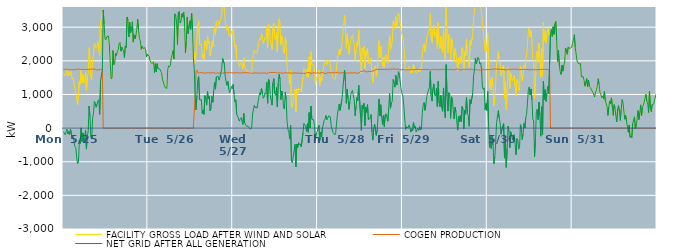
| Category | FACILITY GROSS LOAD AFTER WIND AND SOLAR | COGEN PRODUCTION | NET GRID AFTER ALL GENERATION |
|---|---|---|---|
|  Mon  5/25 | 1643 | 1751 | -108 |
|  Mon  5/25 | 1659 | 1756 | -97 |
|  Mon  5/25 | 1548 | 1749 | -201 |
|  Mon  5/25 | 1628 | 1735 | -107 |
|  Mon  5/25 | 1712 | 1747 | -35 |
|  Mon  5/25 | 1551 | 1727 | -176 |
|  Mon  5/25 | 1649 | 1742 | -93 |
|  Mon  5/25 | 1566 | 1762 | -196 |
|  Mon  5/25 | 1702 | 1733 | -31 |
|  Mon  5/25 | 1574 | 1745 | -171 |
|  Mon  5/25 | 1453 | 1741 | -288 |
|  Mon  5/25 | 1504 | 1746 | -242 |
|  Mon  5/25 | 1310 | 1738 | -428 |
|  Mon  5/25 | 1175 | 1729 | -554 |
|  Mon  5/25 | 1159 | 1743 | -584 |
|  Mon  5/25 | 866 | 1743 | -877 |
|  Mon  5/25 | 698 | 1757 | -1059 |
|  Mon  5/25 | 725 | 1738 | -1013 |
|  Mon  5/25 | 1395 | 1751 | -356 |
|  Mon  5/25 | 1305 | 1763 | -458 |
|  Mon  5/25 | 1745 | 1739 | 6 |
|  Mon  5/25 | 1346 | 1748 | -402 |
|  Mon  5/25 | 1605 | 1747 | -142 |
|  Mon  5/25 | 1348 | 1735 | -387 |
|  Mon  5/25 | 1460 | 1737 | -277 |
|  Mon  5/25 | 1678 | 1737 | -59 |
|  Mon  5/25 | 1126 | 1751 | -625 |
|  Mon  5/25 | 1510 | 1738 | -228 |
|  Mon  5/25 | 1637 | 1738 | -101 |
|  Mon  5/25 | 2393 | 1739 | 654 |
|  Mon  5/25 | 2094 | 1751 | 343 |
|  Mon  5/25 | 1470 | 1745 | -275 |
|  Mon  5/25 | 1432 | 1754 | -322 |
|  Mon  5/25 | 2045 | 1746 | 299 |
|  Mon  5/25 | 2188 | 1751 | 437 |
|  Mon  5/25 | 2523 | 1735 | 788 |
|  Mon  5/25 | 2480 | 1748 | 732 |
|  Mon  5/25 | 2367 | 1748 | 619 |
|  Mon  5/25 | 2435 | 1725 | 710 |
|  Mon  5/25 | 2552 | 1744 | 808 |
|  Mon  5/25 | 2578 | 1733 | 845 |
|  Mon  5/25 | 2157 | 1750 | 407 |
|  Mon  5/25 | 3149 | 1749 | 1400 |
|  Mon  5/25 | 3158 | 1755 | 1403 |
|  Mon  5/25 | 3460 | 1745 | 1715 |
|  Mon  5/25 | 3509 | 0 | 3509 |
|  Mon  5/25 | 3085 | 0 | 3085 |
|  Mon  5/25 | 2661 | 0 | 2661 |
|  Mon  5/25 | 2623 | 0 | 2623 |
|  Mon  5/25 | 2709 | 0 | 2709 |
|  Mon  5/25 | 2681 | 0 | 2681 |
|  Mon  5/25 | 2739 | 0 | 2739 |
|  Mon  5/25 | 2442 | 0 | 2442 |
|  Mon  5/25 | 1900 | 0 | 1900 |
|  Mon  5/25 | 1462 | 0 | 1462 |
|  Mon  5/25 | 1497 | 0 | 1497 |
|  Mon  5/25 | 2306 | 0 | 2306 |
|  Mon  5/25 | 1883 | 0 | 1883 |
|  Mon  5/25 | 1922 | 0 | 1922 |
|  Mon  5/25 | 2224 | 0 | 2224 |
|  Mon  5/25 | 2158 | 0 | 2158 |
|  Mon  5/25 | 2287 | 0 | 2287 |
|  Mon  5/25 | 2330 | 0 | 2330 |
|  Mon  5/25 | 2515 | 0 | 2515 |
|  Mon  5/25 | 2547 | 0 | 2547 |
|  Mon  5/25 | 2285 | 0 | 2285 |
|  Mon  5/25 | 2409 | 0 | 2409 |
|  Mon  5/25 | 2404 | 0 | 2404 |
|  Mon  5/25 | 2295 | 0 | 2295 |
|  Mon  5/25 | 2094 | 0 | 2094 |
|  Mon  5/25 | 2442 | 0 | 2442 |
|  Mon  5/25 | 2391 | 0 | 2391 |
|  Mon  5/25 | 3303 | 0 | 3303 |
|  Mon  5/25 | 3210 | 0 | 3210 |
|  Mon  5/25 | 2708 | 0 | 2708 |
|  Mon  5/25 | 3145 | 0 | 3145 |
|  Mon  5/25 | 2839 | 0 | 2839 |
|  Mon  5/25 | 2936 | 0 | 2936 |
|  Mon  5/25 | 3161 | 0 | 3161 |
|  Mon  5/25 | 2555 | 0 | 2555 |
|  Mon  5/25 | 2771 | 0 | 2771 |
|  Mon  5/25 | 2655 | 0 | 2655 |
|  Mon  5/25 | 2762 | 0 | 2762 |
|  Mon  5/25 | 2939 | 0 | 2939 |
|  Mon  5/25 | 3234 | 0 | 3234 |
|  Mon  5/25 | 2901 | 0 | 2901 |
|  Mon  5/25 | 2656 | 0 | 2656 |
|  Mon  5/25 | 2603 | 0 | 2603 |
|  Mon  5/25 | 2339 | 0 | 2339 |
|  Mon  5/25 | 2437 | 0 | 2437 |
|  Mon  5/25 | 2364 | 0 | 2364 |
|  Mon  5/25 | 2357 | 0 | 2357 |
|  Mon  5/25 | 2392 | 0 | 2392 |
|  Mon  5/25 | 2320 | 0 | 2320 |
|  Mon  5/25 | 2122 | 0 | 2122 |
|  Mon  5/25 | 2197 | 0 | 2197 |
|  Tue  5/26 | 2205 | 0 | 2205 |
|  Tue  5/26 | 2134 | 0 | 2134 |
|  Tue  5/26 | 2007 | 0 | 2007 |
|  Tue  5/26 | 1957 | 0 | 1957 |
|  Tue  5/26 | 1917 | 0 | 1917 |
|  Tue  5/26 | 1929 | 0 | 1929 |
|  Tue  5/26 | 1968 | 0 | 1968 |
|  Tue  5/26 | 1647 | 0 | 1647 |
|  Tue  5/26 | 1913 | 0 | 1913 |
|  Tue  5/26 | 1668 | 0 | 1668 |
|  Tue  5/26 | 1917 | 0 | 1917 |
|  Tue  5/26 | 1763 | 0 | 1763 |
|  Tue  5/26 | 1788 | 0 | 1788 |
|  Tue  5/26 | 1758 | 0 | 1758 |
|  Tue  5/26 | 1742 | 0 | 1742 |
|  Tue  5/26 | 1647 | 0 | 1647 |
|  Tue  5/26 | 1457 | 0 | 1457 |
|  Tue  5/26 | 1370 | 0 | 1370 |
|  Tue  5/26 | 1273 | 0 | 1273 |
|  Tue  5/26 | 1206 | 0 | 1206 |
|  Tue  5/26 | 1228 | 0 | 1228 |
|  Tue  5/26 | 1181 | 0 | 1181 |
|  Tue  5/26 | 1741 | 0 | 1741 |
|  Tue  5/26 | 1853 | 0 | 1853 |
|  Tue  5/26 | 1818 | 0 | 1818 |
|  Tue  5/26 | 1869 | 0 | 1869 |
|  Tue  5/26 | 2098 | 0 | 2098 |
|  Tue  5/26 | 2181 | 0 | 2181 |
|  Tue  5/26 | 2304 | 0 | 2304 |
|  Tue  5/26 | 2061 | 0 | 2061 |
|  Tue  5/26 | 3398 | 0 | 3398 |
|  Tue  5/26 | 3365 | 0 | 3365 |
|  Tue  5/26 | 3157 | 0 | 3157 |
|  Tue  5/26 | 2486 | 0 | 2486 |
|  Tue  5/26 | 3437 | 0 | 3437 |
|  Tue  5/26 | 3474 | 0 | 3474 |
|  Tue  5/26 | 3125 | 0 | 3125 |
|  Tue  5/26 | 3188 | 0 | 3188 |
|  Tue  5/26 | 3402 | 0 | 3402 |
|  Tue  5/26 | 3299 | 0 | 3299 |
|  Tue  5/26 | 3446 | 0 | 3446 |
|  Tue  5/26 | 3129 | 0 | 3129 |
|  Tue  5/26 | 2240 | 0 | 2240 |
|  Tue  5/26 | 2575 | 0 | 2575 |
|  Tue  5/26 | 3301 | 0 | 3301 |
|  Tue  5/26 | 2806 | 0 | 2806 |
|  Tue  5/26 | 2784 | 0 | 2784 |
|  Tue  5/26 | 3188 | 0 | 3188 |
|  Tue  5/26 | 2934 | 0 | 2934 |
|  Tue  5/26 | 3419 | 0 | 3419 |
|  Tue  5/26 | 2978 | 0 | 2978 |
|  Tue  5/26 | 2084 | 0 | 2084 |
|  Tue  5/26 | 2242 | 494 | 1748 |
|  Tue  5/26 | 1927 | 988 | 939 |
|  Tue  5/26 | 2229 | 1690 | 539 |
|  Tue  5/26 | 2681 | 1729 | 952 |
|  Tue  5/26 | 3090 | 1641 | 1449 |
|  Tue  5/26 | 3174 | 1645 | 1529 |
|  Tue  5/26 | 2476 | 1636 | 840 |
|  Tue  5/26 | 2475 | 1653 | 822 |
|  Tue  5/26 | 2495 | 1652 | 843 |
|  Tue  5/26 | 2079 | 1646 | 433 |
|  Tue  5/26 | 2184 | 1644 | 540 |
|  Tue  5/26 | 2045 | 1636 | 409 |
|  Tue  5/26 | 2595 | 1629 | 966 |
|  Tue  5/26 | 2518 | 1641 | 877 |
|  Tue  5/26 | 2324 | 1643 | 681 |
|  Tue  5/26 | 2727 | 1637 | 1090 |
|  Tue  5/26 | 2517 | 1645 | 872 |
|  Tue  5/26 | 2581 | 1638 | 943 |
|  Tue  5/26 | 2149 | 1641 | 508 |
|  Tue  5/26 | 2272 | 1656 | 616 |
|  Tue  5/26 | 2585 | 1641 | 944 |
|  Tue  5/26 | 2407 | 1638 | 769 |
|  Tue  5/26 | 2755 | 1647 | 1108 |
|  Tue  5/26 | 2996 | 1638 | 1358 |
|  Tue  5/26 | 2783 | 1628 | 1155 |
|  Tue  5/26 | 3165 | 1643 | 1522 |
|  Tue  5/26 | 3164 | 1641 | 1523 |
|  Tue  5/26 | 3192 | 1650 | 1542 |
|  Tue  5/26 | 3053 | 1631 | 1422 |
|  Tue  5/26 | 3136 | 1634 | 1502 |
|  Tue  5/26 | 3253 | 1636 | 1617 |
|  Tue  5/26 | 3383 | 1634 | 1749 |
|  Tue  5/26 | 3710 | 1637 | 2073 |
|  Tue  5/26 | 3709 | 1651 | 2058 |
|  Tue  5/26 | 3550 | 1636 | 1914 |
|  Tue  5/26 | 3175 | 1642 | 1533 |
|  Tue  5/26 | 3041 | 1652 | 1389 |
|  Tue  5/26 | 2911 | 1637 | 1274 |
|  Tue  5/26 | 3023 | 1640 | 1383 |
|  Tue  5/26 | 2811 | 1642 | 1169 |
|  Tue  5/26 | 2710 | 1655 | 1055 |
|  Tue  5/26 | 2749 | 1635 | 1114 |
|  Tue  5/26 | 2884 | 1644 | 1240 |
|  Tue  5/26 | 2816 | 1648 | 1168 |
|  Wed  5/27 | 2939 | 1642 | 1297 |
|  Wed  5/27 | 2653 | 1640 | 1013 |
|  Wed  5/27 | 2418 | 1639 | 779 |
|  Wed  5/27 | 2476 | 1634 | 842 |
|  Wed  5/27 | 2068 | 1656 | 412 |
|  Wed  5/27 | 2062 | 1662 | 400 |
|  Wed  5/27 | 1936 | 1640 | 296 |
|  Wed  5/27 | 1834 | 1627 | 207 |
|  Wed  5/27 | 1917 | 1636 | 281 |
|  Wed  5/27 | 1956 | 1644 | 312 |
|  Wed  5/27 | 1932 | 1643 | 289 |
|  Wed  5/27 | 1751 | 1645 | 106 |
|  Wed  5/27 | 2083 | 1647 | 436 |
|  Wed  5/27 | 1812 | 1653 | 159 |
|  Wed  5/27 | 1779 | 1649 | 130 |
|  Wed  5/27 | 1702 | 1644 | 58 |
|  Wed  5/27 | 1691 | 1646 | 45 |
|  Wed  5/27 | 1696 | 1642 | 54 |
|  Wed  5/27 | 1650 | 1638 | 12 |
|  Wed  5/27 | 1651 | 1637 | 14 |
|  Wed  5/27 | 1602 | 1631 | -29 |
|  Wed  5/27 | 1669 | 1643 | 26 |
|  Wed  5/27 | 2047 | 1629 | 418 |
|  Wed  5/27 | 2222 | 1651 | 571 |
|  Wed  5/27 | 2324 | 1645 | 679 |
|  Wed  5/27 | 2240 | 1642 | 598 |
|  Wed  5/27 | 2269 | 1635 | 634 |
|  Wed  5/27 | 2229 | 1638 | 591 |
|  Wed  5/27 | 2236 | 1642 | 594 |
|  Wed  5/27 | 2549 | 1640 | 909 |
|  Wed  5/27 | 2680 | 1630 | 1050 |
|  Wed  5/27 | 2618 | 1636 | 982 |
|  Wed  5/27 | 2810 | 1632 | 1178 |
|  Wed  5/27 | 2711 | 1633 | 1078 |
|  Wed  5/27 | 2522 | 1637 | 885 |
|  Wed  5/27 | 2545 | 1623 | 922 |
|  Wed  5/27 | 2683 | 1638 | 1045 |
|  Wed  5/27 | 2644 | 1637 | 1007 |
|  Wed  5/27 | 2996 | 1627 | 1369 |
|  Wed  5/27 | 2395 | 1656 | 739 |
|  Wed  5/27 | 3100 | 1645 | 1455 |
|  Wed  5/27 | 3027 | 1651 | 1376 |
|  Wed  5/27 | 2623 | 1653 | 970 |
|  Wed  5/27 | 2611 | 1636 | 975 |
|  Wed  5/27 | 2336 | 1653 | 683 |
|  Wed  5/27 | 2991 | 1651 | 1340 |
|  Wed  5/27 | 3126 | 1656 | 1470 |
|  Wed  5/27 | 2668 | 1634 | 1034 |
|  Wed  5/27 | 2625 | 1651 | 974 |
|  Wed  5/27 | 2852 | 1648 | 1204 |
|  Wed  5/27 | 2266 | 1633 | 633 |
|  Wed  5/27 | 2986 | 1647 | 1339 |
|  Wed  5/27 | 3252 | 1651 | 1601 |
|  Wed  5/27 | 3096 | 1639 | 1457 |
|  Wed  5/27 | 2485 | 1638 | 847 |
|  Wed  5/27 | 2739 | 1636 | 1103 |
|  Wed  5/27 | 2595 | 1630 | 965 |
|  Wed  5/27 | 2252 | 1644 | 608 |
|  Wed  5/27 | 2210 | 1644 | 566 |
|  Wed  5/27 | 2707 | 1639 | 1068 |
|  Wed  5/27 | 2494 | 1644 | 850 |
|  Wed  5/27 | 1830 | 1637 | 193 |
|  Wed  5/27 | 1608 | 1639 | -31 |
|  Wed  5/27 | 1537 | 1654 | -117 |
|  Wed  5/27 | 1314 | 1642 | -328 |
|  Wed  5/27 | 1722 | 1636 | 86 |
|  Wed  5/27 | 643 | 1631 | -988 |
|  Wed  5/27 | 610 | 1643 | -1033 |
|  Wed  5/27 | 807 | 1637 | -830 |
|  Wed  5/27 | 964 | 1629 | -665 |
|  Wed  5/27 | 1156 | 1640 | -484 |
|  Wed  5/27 | 480 | 1632 | -1152 |
|  Wed  5/27 | 1166 | 1641 | -475 |
|  Wed  5/27 | 1063 | 1641 | -578 |
|  Wed  5/27 | 1191 | 1629 | -438 |
|  Wed  5/27 | 1134 | 1632 | -498 |
|  Wed  5/27 | 1164 | 1632 | -468 |
|  Wed  5/27 | 1083 | 1641 | -558 |
|  Wed  5/27 | 1097 | 1632 | -535 |
|  Wed  5/27 | 1498 | 1638 | -140 |
|  Wed  5/27 | 1767 | 1628 | 139 |
|  Wed  5/27 | 1752 | 1632 | 120 |
|  Wed  5/27 | 1681 | 1625 | 56 |
|  Wed  5/27 | 1538 | 1639 | -101 |
|  Wed  5/27 | 1778 | 1649 | 129 |
|  Wed  5/27 | 1511 | 1637 | -126 |
|  Wed  5/27 | 2118 | 1655 | 463 |
|  Wed  5/27 | 1642 | 1638 | 4 |
|  Wed  5/27 | 2275 | 1625 | 650 |
|  Wed  5/27 | 1898 | 1634 | 264 |
|  Wed  5/27 | 1886 | 1637 | 249 |
|  Wed  5/27 | 1882 | 1633 | 249 |
|  Wed  5/27 | 1726 | 1648 | 78 |
|  Wed  5/27 | 1301 | 1654 | -353 |
|  Wed  5/27 | 1497 | 1631 | -134 |
|  Wed  5/27 | 1535 | 1636 | -101 |
|  Thu  5/28 | 1523 | 1646 | -123 |
|  Thu  5/28 | 1715 | 1630 | 85 |
|  Thu  5/28 | 1269 | 1631 | -362 |
|  Thu  5/28 | 1526 | 1643 | -117 |
|  Thu  5/28 | 1387 | 1653 | -266 |
|  Thu  5/28 | 1649 | 1645 | 4 |
|  Thu  5/28 | 1646 | 1641 | 5 |
|  Thu  5/28 | 1875 | 1651 | 224 |
|  Thu  5/28 | 1893 | 1622 | 271 |
|  Thu  5/28 | 2021 | 1649 | 372 |
|  Thu  5/28 | 1883 | 1633 | 250 |
|  Thu  5/28 | 1930 | 1635 | 295 |
|  Thu  5/28 | 2015 | 1651 | 364 |
|  Thu  5/28 | 1980 | 1638 | 342 |
|  Thu  5/28 | 1979 | 1643 | 336 |
|  Thu  5/28 | 1683 | 1642 | 41 |
|  Thu  5/28 | 1682 | 1648 | 34 |
|  Thu  5/28 | 1504 | 1633 | -129 |
|  Thu  5/28 | 1474 | 1640 | -166 |
|  Thu  5/28 | 1438 | 1640 | -202 |
|  Thu  5/28 | 1521 | 1650 | -129 |
|  Thu  5/28 | 1538 | 1653 | -115 |
|  Thu  5/28 | 2078 | 1658 | 420 |
|  Thu  5/28 | 2209 | 1638 | 571 |
|  Thu  5/28 | 2351 | 1636 | 715 |
|  Thu  5/28 | 2185 | 1657 | 528 |
|  Thu  5/28 | 2191 | 1640 | 551 |
|  Thu  5/28 | 2478 | 1631 | 847 |
|  Thu  5/28 | 2785 | 1650 | 1135 |
|  Thu  5/28 | 2804 | 1652 | 1152 |
|  Thu  5/28 | 3363 | 1641 | 1722 |
|  Thu  5/28 | 3030 | 1646 | 1384 |
|  Thu  5/28 | 2370 | 1633 | 737 |
|  Thu  5/28 | 2794 | 1641 | 1153 |
|  Thu  5/28 | 2513 | 1642 | 871 |
|  Thu  5/28 | 2193 | 1636 | 557 |
|  Thu  5/28 | 2412 | 1639 | 773 |
|  Thu  5/28 | 2632 | 1645 | 987 |
|  Thu  5/28 | 2719 | 1640 | 1079 |
|  Thu  5/28 | 2769 | 1644 | 1125 |
|  Thu  5/28 | 2597 | 1642 | 955 |
|  Thu  5/28 | 2499 | 1657 | 842 |
|  Thu  5/28 | 2013 | 1643 | 370 |
|  Thu  5/28 | 2296 | 1645 | 651 |
|  Thu  5/28 | 2543 | 1633 | 910 |
|  Thu  5/28 | 2452 | 1647 | 805 |
|  Thu  5/28 | 2911 | 1632 | 1279 |
|  Thu  5/28 | 2895 | 1645 | 1250 |
|  Thu  5/28 | 2108 | 1682 | 426 |
|  Thu  5/28 | 1627 | 1697 | -70 |
|  Thu  5/28 | 2365 | 1684 | 681 |
|  Thu  5/28 | 2259 | 1686 | 573 |
|  Thu  5/28 | 2440 | 1707 | 733 |
|  Thu  5/28 | 1776 | 1705 | 71 |
|  Thu  5/28 | 2298 | 1678 | 620 |
|  Thu  5/28 | 2168 | 1700 | 468 |
|  Thu  5/28 | 2372 | 1674 | 698 |
|  Thu  5/28 | 1946 | 1695 | 251 |
|  Thu  5/28 | 1914 | 1685 | 229 |
|  Thu  5/28 | 2000 | 1697 | 303 |
|  Thu  5/28 | 2083 | 1681 | 402 |
|  Thu  5/28 | 1576 | 1694 | -118 |
|  Thu  5/28 | 1346 | 1705 | -359 |
|  Thu  5/28 | 1657 | 1687 | -30 |
|  Thu  5/28 | 1824 | 1702 | 122 |
|  Thu  5/28 | 1872 | 1746 | 126 |
|  Thu  5/28 | 1532 | 1748 | -216 |
|  Thu  5/28 | 1711 | 1748 | -37 |
|  Thu  5/28 | 2138 | 1748 | 390 |
|  Thu  5/28 | 2609 | 1745 | 864 |
|  Thu  5/28 | 2093 | 1736 | 357 |
|  Thu  5/28 | 2440 | 1747 | 693 |
|  Thu  5/28 | 2096 | 1767 | 329 |
|  Thu  5/28 | 1843 | 1738 | 105 |
|  Thu  5/28 | 2117 | 1741 | 376 |
|  Thu  5/28 | 1789 | 1747 | 42 |
|  Thu  5/28 | 2129 | 1736 | 393 |
|  Thu  5/28 | 2178 | 1751 | 427 |
|  Thu  5/28 | 2039 | 1742 | 297 |
|  Thu  5/28 | 1932 | 1728 | 204 |
|  Thu  5/28 | 2347 | 1758 | 589 |
|  Thu  5/28 | 2768 | 1739 | 1029 |
|  Thu  5/28 | 2341 | 1749 | 592 |
|  Thu  5/28 | 2483 | 1725 | 758 |
|  Thu  5/28 | 2541 | 1751 | 790 |
|  Thu  5/28 | 3188 | 1744 | 1444 |
|  Thu  5/28 | 3089 | 1759 | 1330 |
|  Thu  5/28 | 2957 | 1740 | 1217 |
|  Thu  5/28 | 3313 | 1746 | 1567 |
|  Thu  5/28 | 3023 | 1744 | 1279 |
|  Thu  5/28 | 3121 | 1760 | 1361 |
|  Thu  5/28 | 3412 | 1737 | 1675 |
|  Thu  5/28 | 3317 | 1733 | 1584 |
|  Thu  5/28 | 3316 | 1734 | 1582 |
|  Thu  5/28 | 2901 | 1735 | 1166 |
|  Thu  5/28 | 2772 | 1748 | 1024 |
|  Fri  5/29 | 2699 | 1746 | 953 |
|  Fri  5/29 | 2445 | 1754 | 691 |
|  Fri  5/29 | 2428 | 1736 | 692 |
|  Fri  5/29 | 1719 | 1753 | -34 |
|  Fri  5/29 | 1769 | 1725 | 44 |
|  Fri  5/29 | 1781 | 1738 | 43 |
|  Fri  5/29 | 1755 | 1752 | 3 |
|  Fri  5/29 | 1838 | 1741 | 97 |
|  Fri  5/29 | 1736 | 1723 | 13 |
|  Fri  5/29 | 1629 | 1748 | -119 |
|  Fri  5/29 | 1721 | 1743 | -22 |
|  Fri  5/29 | 1648 | 1730 | -82 |
|  Fri  5/29 | 1897 | 1734 | 163 |
|  Fri  5/29 | 1774 | 1757 | 17 |
|  Fri  5/29 | 1799 | 1741 | 58 |
|  Fri  5/29 | 1629 | 1741 | -112 |
|  Fri  5/29 | 1651 | 1752 | -101 |
|  Fri  5/29 | 1745 | 1748 | -3 |
|  Fri  5/29 | 1677 | 1749 | -72 |
|  Fri  5/29 | 1793 | 1751 | 42 |
|  Fri  5/29 | 1678 | 1736 | -58 |
|  Fri  5/29 | 1723 | 1747 | -24 |
|  Fri  5/29 | 2208 | 1742 | 466 |
|  Fri  5/29 | 2433 | 1759 | 674 |
|  Fri  5/29 | 2506 | 1748 | 758 |
|  Fri  5/29 | 2271 | 1742 | 529 |
|  Fri  5/29 | 2436 | 1739 | 697 |
|  Fri  5/29 | 2676 | 1738 | 938 |
|  Fri  5/29 | 2784 | 1741 | 1043 |
|  Fri  5/29 | 2774 | 1750 | 1024 |
|  Fri  5/29 | 2936 | 1738 | 1198 |
|  Fri  5/29 | 3411 | 1729 | 1682 |
|  Fri  5/29 | 2694 | 1728 | 966 |
|  Fri  5/29 | 2545 | 1742 | 803 |
|  Fri  5/29 | 2915 | 1743 | 1172 |
|  Fri  5/29 | 3058 | 1743 | 1315 |
|  Fri  5/29 | 2740 | 1745 | 995 |
|  Fri  5/29 | 2699 | 1748 | 951 |
|  Fri  5/29 | 2930 | 1751 | 1179 |
|  Fri  5/29 | 2358 | 1716 | 642 |
|  Fri  5/29 | 3135 | 1751 | 1384 |
|  Fri  5/29 | 2473 | 1730 | 743 |
|  Fri  5/29 | 2366 | 1731 | 635 |
|  Fri  5/29 | 2730 | 1755 | 975 |
|  Fri  5/29 | 2366 | 1753 | 613 |
|  Fri  5/29 | 2249 | 1751 | 498 |
|  Fri  5/29 | 2938 | 1745 | 1193 |
|  Fri  5/29 | 2321 | 1738 | 583 |
|  Fri  5/29 | 2038 | 1739 | 299 |
|  Fri  5/29 | 3618 | 1732 | 1886 |
|  Fri  5/29 | 2692 | 1752 | 940 |
|  Fri  5/29 | 2232 | 1729 | 503 |
|  Fri  5/29 | 2790 | 1738 | 1052 |
|  Fri  5/29 | 2731 | 1735 | 996 |
|  Fri  5/29 | 2037 | 1747 | 290 |
|  Fri  5/29 | 2667 | 1738 | 929 |
|  Fri  5/29 | 2596 | 1738 | 858 |
|  Fri  5/29 | 2253 | 1737 | 516 |
|  Fri  5/29 | 2004 | 1731 | 273 |
|  Fri  5/29 | 2360 | 1739 | 621 |
|  Fri  5/29 | 2230 | 1743 | 487 |
|  Fri  5/29 | 2228 | 1749 | 479 |
|  Fri  5/29 | 1701 | 1762 | -61 |
|  Fri  5/29 | 2089 | 1736 | 353 |
|  Fri  5/29 | 1925 | 1736 | 189 |
|  Fri  5/29 | 2124 | 1748 | 376 |
|  Fri  5/29 | 1916 | 1723 | 193 |
|  Fri  5/29 | 2389 | 1746 | 643 |
|  Fri  5/29 | 2325 | 1749 | 576 |
|  Fri  5/29 | 1714 | 1735 | -21 |
|  Fri  5/29 | 2279 | 1746 | 533 |
|  Fri  5/29 | 2145 | 1733 | 412 |
|  Fri  5/29 | 2649 | 1742 | 907 |
|  Fri  5/29 | 2183 | 1742 | 441 |
|  Fri  5/29 | 2106 | 1739 | 367 |
|  Fri  5/29 | 1798 | 1743 | 55 |
|  Fri  5/29 | 2603 | 1756 | 847 |
|  Fri  5/29 | 2466 | 1742 | 724 |
|  Fri  5/29 | 2454 | 1744 | 710 |
|  Fri  5/29 | 2769 | 1737 | 1032 |
|  Fri  5/29 | 3296 | 1734 | 1562 |
|  Fri  5/29 | 3469 | 1740 | 1729 |
|  Fri  5/29 | 3822 | 1740 | 2082 |
|  Fri  5/29 | 3644 | 1729 | 1915 |
|  Fri  5/29 | 3640 | 1734 | 1906 |
|  Fri  5/29 | 3853 | 1754 | 2099 |
|  Fri  5/29 | 3776 | 1728 | 2048 |
|  Fri  5/29 | 3643 | 1738 | 1905 |
|  Fri  5/29 | 3657 | 1716 | 1941 |
|  Fri  5/29 | 3493 | 1745 | 1748 |
|  Fri  5/29 | 2961 | 1748 | 1213 |
|  Fri  5/29 | 2904 | 1753 | 1151 |
|  Fri  5/29 | 2933 | 1734 | 1199 |
|  Fri  5/29 | 2294 | 1745 | 549 |
|  Fri  5/29 | 2468 | 1735 | 733 |
|  Fri  5/29 | 2271 | 1748 | 523 |
|  Sat  5/30 | 2831 | 1744 | 1087 |
|  Sat  5/30 | 1789 | 1735 | 54 |
|  Sat  5/30 | 1171 | 1742 | -571 |
|  Sat  5/30 | 1445 | 1737 | -292 |
|  Sat  5/30 | 1136 | 1743 | -607 |
|  Sat  5/30 | 1508 | 1734 | -226 |
|  Sat  5/30 | 1249 | 1752 | -503 |
|  Sat  5/30 | 668 | 1732 | -1064 |
|  Sat  5/30 | 900 | 1758 | -858 |
|  Sat  5/30 | 1325 | 1742 | -417 |
|  Sat  5/30 | 1917 | 1747 | 170 |
|  Sat  5/30 | 1944 | 1748 | 196 |
|  Sat  5/30 | 2280 | 1760 | 520 |
|  Sat  5/30 | 2033 | 1742 | 291 |
|  Sat  5/30 | 1903 | 1746 | 157 |
|  Sat  5/30 | 1557 | 1739 | -182 |
|  Sat  5/30 | 1558 | 1746 | -188 |
|  Sat  5/30 | 1814 | 1749 | 65 |
|  Sat  5/30 | 1874 | 1740 | 134 |
|  Sat  5/30 | 864 | 1757 | -893 |
|  Sat  5/30 | 1381 | 1745 | -364 |
|  Sat  5/30 | 542 | 1713 | -1171 |
|  Sat  5/30 | 1128 | 1744 | -616 |
|  Sat  5/30 | 1809 | 1750 | 59 |
|  Sat  5/30 | 1650 | 1753 | -103 |
|  Sat  5/30 | 1166 | 1746 | -580 |
|  Sat  5/30 | 1633 | 1742 | -109 |
|  Sat  5/30 | 1517 | 1729 | -212 |
|  Sat  5/30 | 1405 | 1753 | -348 |
|  Sat  5/30 | 1492 | 1724 | -232 |
|  Sat  5/30 | 1565 | 1752 | -187 |
|  Sat  5/30 | 1259 | 1747 | -488 |
|  Sat  5/30 | 954 | 1748 | -794 |
|  Sat  5/30 | 1444 | 1756 | -312 |
|  Sat  5/30 | 1392 | 1747 | -355 |
|  Sat  5/30 | 1107 | 1737 | -630 |
|  Sat  5/30 | 1164 | 1737 | -573 |
|  Sat  5/30 | 1850 | 1748 | 102 |
|  Sat  5/30 | 1732 | 1743 | -11 |
|  Sat  5/30 | 1401 | 1741 | -340 |
|  Sat  5/30 | 1569 | 1740 | -171 |
|  Sat  5/30 | 1876 | 1734 | 142 |
|  Sat  5/30 | 1756 | 1754 | 2 |
|  Sat  5/30 | 2047 | 1730 | 317 |
|  Sat  5/30 | 2148 | 1741 | 407 |
|  Sat  5/30 | 2160 | 1754 | 406 |
|  Sat  5/30 | 2883 | 1738 | 1145 |
|  Sat  5/30 | 2974 | 1756 | 1218 |
|  Sat  5/30 | 2719 | 1734 | 985 |
|  Sat  5/30 | 2899 | 1736 | 1163 |
|  Sat  5/30 | 2585 | 1749 | 836 |
|  Sat  5/30 | 2017 | 1741 | 276 |
|  Sat  5/30 | 1939 | 1731 | 208 |
|  Sat  5/30 | 885 | 1735 | -850 |
|  Sat  5/30 | 1400 | 1740 | -340 |
|  Sat  5/30 | 2228 | 1742 | 486 |
|  Sat  5/30 | 2287 | 1728 | 559 |
|  Sat  5/30 | 1988 | 1735 | 253 |
|  Sat  5/30 | 2522 | 1747 | 775 |
|  Sat  5/30 | 2089 | 1721 | 368 |
|  Sat  5/30 | 1498 | 1741 | -243 |
|  Sat  5/30 | 2384 | 1747 | 637 |
|  Sat  5/30 | 1544 | 1749 | -205 |
|  Sat  5/30 | 3138 | 1739 | 1399 |
|  Sat  5/30 | 2600 | 1748 | 852 |
|  Sat  5/30 | 2893 | 1751 | 1142 |
|  Sat  5/30 | 2539 | 1744 | 795 |
|  Sat  5/30 | 2766 | 1728 | 1038 |
|  Sat  5/30 | 2982 | 1742 | 1240 |
|  Sat  5/30 | 2775 | 1755 | 1020 |
|  Sat  5/30 | 2762 | 1731 | 1031 |
|  Sat  5/30 | 2803 | 0 | 2803 |
|  Sat  5/30 | 2935 | 0 | 2935 |
|  Sat  5/30 | 2728 | 0 | 2728 |
|  Sat  5/30 | 3013 | 0 | 3013 |
|  Sat  5/30 | 2788 | 0 | 2788 |
|  Sat  5/30 | 3106 | 0 | 3106 |
|  Sat  5/30 | 3169 | 0 | 3169 |
|  Sat  5/30 | 2610 | 0 | 2610 |
|  Sat  5/30 | 1983 | 0 | 1983 |
|  Sat  5/30 | 2321 | 0 | 2321 |
|  Sat  5/30 | 1873 | 0 | 1873 |
|  Sat  5/30 | 1673 | 0 | 1673 |
|  Sat  5/30 | 1593 | 0 | 1593 |
|  Sat  5/30 | 1869 | 0 | 1869 |
|  Sat  5/30 | 1691 | 0 | 1691 |
|  Sat  5/30 | 1851 | 0 | 1851 |
|  Sat  5/30 | 1957 | 0 | 1957 |
|  Sat  5/30 | 2378 | 0 | 2378 |
|  Sat  5/30 | 2293 | 0 | 2293 |
|  Sat  5/30 | 2194 | 0 | 2194 |
|  Sat  5/30 | 2407 | 0 | 2407 |
|  Sat  5/30 | 2414 | 0 | 2414 |
|  Sat  5/30 | 2368 | 0 | 2368 |
|  Sat  5/30 | 2362 | 0 | 2362 |
|  Sat  5/30 | 2406 | 0 | 2406 |
|  Sun  5/31 | 2525 | 0 | 2525 |
|  Sun  5/31 | 2624 | 0 | 2624 |
|  Sun  5/31 | 2776 | 0 | 2776 |
|  Sun  5/31 | 2399 | 0 | 2399 |
|  Sun  5/31 | 2375 | 0 | 2375 |
|  Sun  5/31 | 2007 | 0 | 2007 |
|  Sun  5/31 | 1946 | 0 | 1946 |
|  Sun  5/31 | 1905 | 0 | 1905 |
|  Sun  5/31 | 1887 | 0 | 1887 |
|  Sun  5/31 | 1923 | 0 | 1923 |
|  Sun  5/31 | 1524 | 0 | 1524 |
|  Sun  5/31 | 1512 | 0 | 1512 |
|  Sun  5/31 | 1532 | 0 | 1532 |
|  Sun  5/31 | 1417 | 0 | 1417 |
|  Sun  5/31 | 1245 | 0 | 1245 |
|  Sun  5/31 | 1234 | 0 | 1234 |
|  Sun  5/31 | 1470 | 0 | 1470 |
|  Sun  5/31 | 1225 | 0 | 1225 |
|  Sun  5/31 | 1427 | 0 | 1427 |
|  Sun  5/31 | 1258 | 0 | 1258 |
|  Sun  5/31 | 1205 | 0 | 1205 |
|  Sun  5/31 | 1182 | 0 | 1182 |
|  Sun  5/31 | 1107 | 0 | 1107 |
|  Sun  5/31 | 1062 | 0 | 1062 |
|  Sun  5/31 | 1078 | 0 | 1078 |
|  Sun  5/31 | 924 | 0 | 924 |
|  Sun  5/31 | 1080 | 0 | 1080 |
|  Sun  5/31 | 1131 | 0 | 1131 |
|  Sun  5/31 | 1263 | 0 | 1263 |
|  Sun  5/31 | 1466 | 0 | 1466 |
|  Sun  5/31 | 1303 | 0 | 1303 |
|  Sun  5/31 | 1053 | 0 | 1053 |
|  Sun  5/31 | 1001 | 0 | 1001 |
|  Sun  5/31 | 904 | 0 | 904 |
|  Sun  5/31 | 947 | 0 | 947 |
|  Sun  5/31 | 873 | 0 | 873 |
|  Sun  5/31 | 1087 | 0 | 1087 |
|  Sun  5/31 | 815 | 0 | 815 |
|  Sun  5/31 | 807 | 0 | 807 |
|  Sun  5/31 | 651 | 0 | 651 |
|  Sun  5/31 | 375 | 0 | 375 |
|  Sun  5/31 | 639 | 0 | 639 |
|  Sun  5/31 | 802 | 0 | 802 |
|  Sun  5/31 | 727 | 0 | 727 |
|  Sun  5/31 | 900 | 0 | 900 |
|  Sun  5/31 | 630 | 0 | 630 |
|  Sun  5/31 | 378 | 0 | 378 |
|  Sun  5/31 | 696 | 0 | 696 |
|  Sun  5/31 | 601 | 0 | 601 |
|  Sun  5/31 | 340 | 0 | 340 |
|  Sun  5/31 | 186 | 0 | 186 |
|  Sun  5/31 | 570 | 0 | 570 |
|  Sun  5/31 | 668 | 0 | 668 |
|  Sun  5/31 | 487 | 0 | 487 |
|  Sun  5/31 | 227 | 0 | 227 |
|  Sun  5/31 | 551 | 0 | 551 |
|  Sun  5/31 | 850 | 0 | 850 |
|  Sun  5/31 | 753 | 0 | 753 |
|  Sun  5/31 | 508 | 0 | 508 |
|  Sun  5/31 | 264 | 0 | 264 |
|  Sun  5/31 | 376 | 0 | 376 |
|  Sun  5/31 | 210 | 0 | 210 |
|  Sun  5/31 | 49 | 0 | 49 |
|  Sun  5/31 | -125 | 0 | -125 |
|  Sun  5/31 | 92 | 0 | 92 |
|  Sun  5/31 | -274 | 0 | -274 |
|  Sun  5/31 | -235 | 0 | -235 |
|  Sun  5/31 | -289 | 0 | -289 |
|  Sun  5/31 | 139 | 0 | 139 |
|  Sun  5/31 | 128 | 0 | 128 |
|  Sun  5/31 | 335 | 0 | 335 |
|  Sun  5/31 | -20 | 0 | -20 |
|  Sun  5/31 | 23 | 0 | 23 |
|  Sun  5/31 | 282 | 0 | 282 |
|  Sun  5/31 | 521 | 0 | 521 |
|  Sun  5/31 | 253 | 0 | 253 |
|  Sun  5/31 | 444 | 0 | 444 |
|  Sun  5/31 | 691 | 0 | 691 |
|  Sun  5/31 | 371 | 0 | 371 |
|  Sun  5/31 | 620 | 0 | 620 |
|  Sun  5/31 | 680 | 0 | 680 |
|  Sun  5/31 | 774 | 0 | 774 |
|  Sun  5/31 | 769 | 0 | 769 |
|  Sun  5/31 | 1002 | 0 | 1002 |
|  Sun  5/31 | 797 | 0 | 797 |
|  Sun  5/31 | 714 | 0 | 714 |
|  Sun  5/31 | 462 | 0 | 462 |
|  Sun  5/31 | 1094 | 0 | 1094 |
|  Sun  5/31 | 610 | 0 | 610 |
|  Sun  5/31 | 489 | 0 | 489 |
|  Sun  5/31 | 697 | 0 | 697 |
|  Sun  5/31 | 668 | 0 | 668 |
|  Sun  5/31 | 723 | 0 | 723 |
|  Sun  5/31 | 870 | 0 | 870 |
|  Sun  5/31 | 956 | 0 | 956 |
|  Sun  5/31 | 1039 | 0 | 1039 |